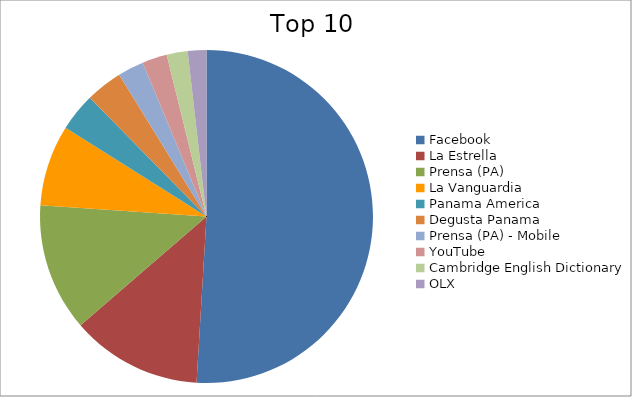
| Category | Series 0 |
|---|---|
| Facebook | 32.36 |
| La Estrella | 8.07 |
| Prensa (PA) | 7.88 |
| La Vanguardia | 5 |
| Panama America | 2.35 |
| Degusta Panama | 2.27 |
| Prensa (PA) - Mobile | 1.61 |
| YouTube | 1.53 |
| Cambridge English Dictionary | 1.29 |
| OLX | 1.15 |